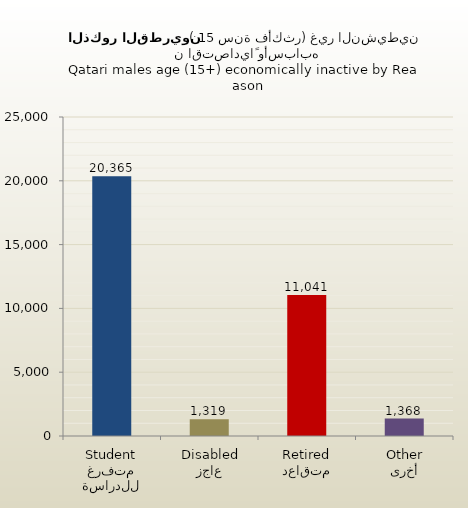
| Category | الذكور القطريين |
|---|---|
| متفرغ للدراسة
Student | 20365 |
| عاجز
Disabled | 1319 |
| متقاعد
Retired | 11041 |
| أخرى
Other | 1368 |